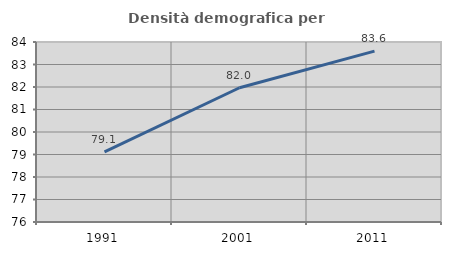
| Category | Densità demografica |
|---|---|
| 1991.0 | 79.12 |
| 2001.0 | 81.967 |
| 2011.0 | 83.594 |